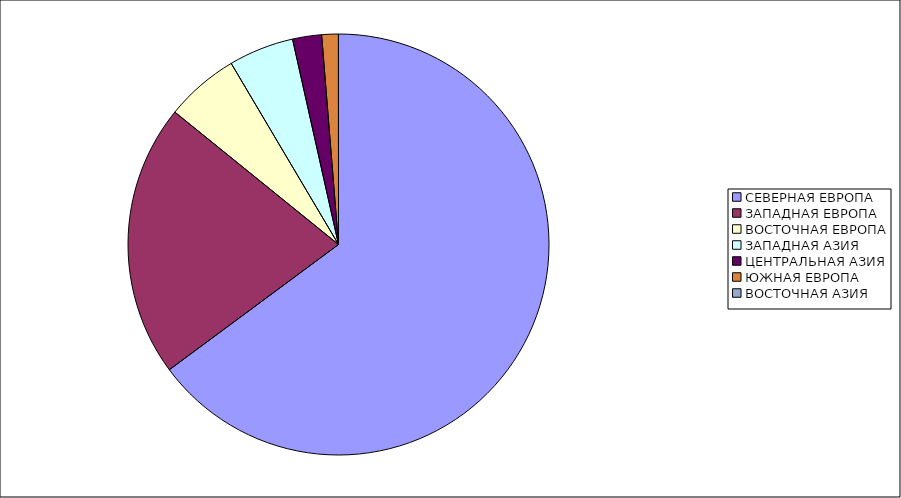
| Category | Оборот |
|---|---|
| СЕВЕРНАЯ ЕВРОПА | 64.855 |
| ЗАПАДНАЯ ЕВРОПА | 20.971 |
| ВОСТОЧНАЯ ЕВРОПА | 5.66 |
| ЗАПАДНАЯ АЗИЯ | 5.008 |
| ЦЕНТРАЛЬНАЯ АЗИЯ | 2.226 |
| ЮЖНАЯ ЕВРОПА | 1.274 |
| ВОСТОЧНАЯ АЗИЯ | 0.006 |